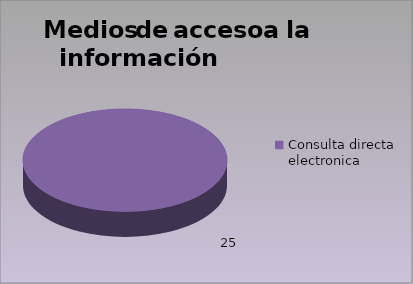
| Category | Series 0 |
|---|---|
| Consulta directa electronica | 25 |